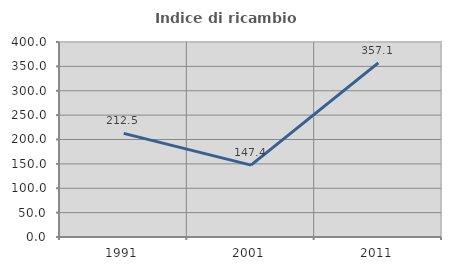
| Category | Indice di ricambio occupazionale  |
|---|---|
| 1991.0 | 212.5 |
| 2001.0 | 147.368 |
| 2011.0 | 357.143 |